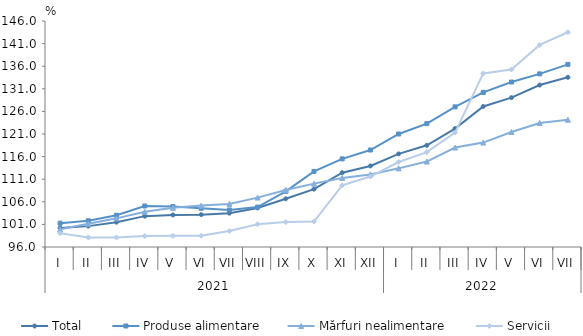
| Category | Total  | Produse alimentare | Mărfuri nealimentare  | Servicii |
|---|---|---|---|---|
| 0 | 100.216 | 101.263 | 99.917 | 99.046 |
| 1 | 100.619 | 101.8 | 101.154 | 98.109 |
| 2 | 101.493 | 103.024 | 102.337 | 98.107 |
| 3 | 102.826 | 105.075 | 103.801 | 98.417 |
| 4 | 103.092 | 104.95 | 104.66 | 98.463 |
| 5 | 103.16 | 104.567 | 105.161 | 98.472 |
| 6 | 103.487 | 104.197 | 105.536 | 99.549 |
| 7 | 104.645 | 104.834 | 106.928 | 101.023 |
| 8 | 106.675 | 108.308 | 108.624 | 101.521 |
| 9 | 108.814 | 112.725 | 110.021 | 101.642 |
| 10 | 112.438 | 115.494 | 111.282 | 109.649 |
| 11 | 113.937 | 117.461 | 112.055 | 111.591 |
| 12 | 116.6 | 121 | 113.4 | 114.8 |
| 13 | 118.5 | 123.3 | 114.9 | 117 |
| 14 | 122.2 | 127 | 118 | 121.3 |
| 15 | 127.1 | 130.2 | 119.1 | 134.4 |
| 16 | 129.047 | 132.5 | 121.45 | 135.267 |
| 17 | 131.827 | 134.301 | 123.443 | 140.701 |
| 18 | 133.547 | 136.399 | 124.168 | 143.511 |